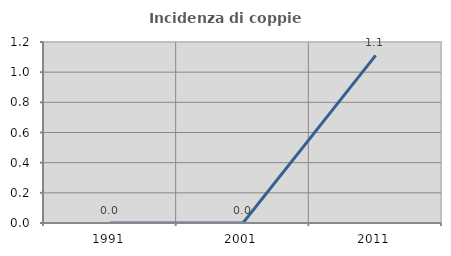
| Category | Incidenza di coppie miste |
|---|---|
| 1991.0 | 0 |
| 2001.0 | 0 |
| 2011.0 | 1.111 |